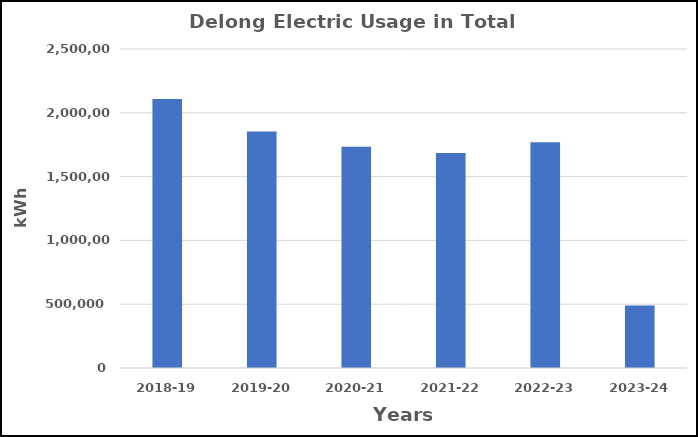
| Category | Series 0 |
|---|---|
| 2018-19 | 2107921 |
| 2019-20 | 1853253 |
| 2020-21 | 1733764 |
| 2021-22 | 1684960 |
| 2022-23 | 1769734 |
| 2023-24 | 490721 |